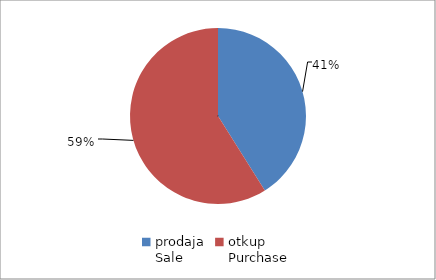
| Category | Series 0 |
|---|---|
| prodaja
Sale | 78900478.79 |
| otkup
Purchase | 113230573.5 |